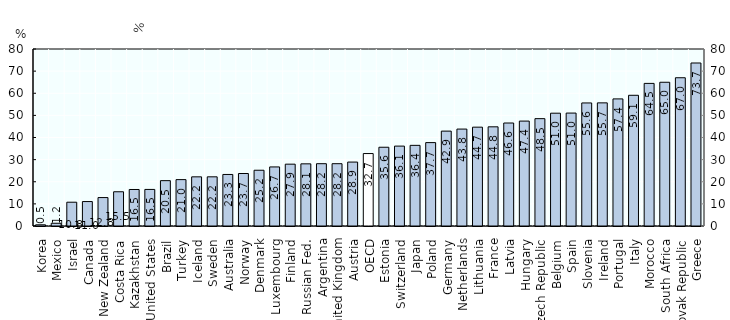
| Category | LTU Q3 2015 |
|---|---|
| Korea  | 0.538 |
| Mexico  | 1.238 |
| Israel  | 10.753 |
| Canada  | 11.049 |
| New Zealand  | 12.847 |
| Costa Rica  | 15.475 |
| Kazakhstan  | 16.5 |
| United States  | 16.532 |
| Brazil  | 20.497 |
| Turkey  | 20.964 |
| Iceland  | 22.222 |
| Sweden  | 22.226 |
| Australia  | 23.298 |
| Norway  | 23.723 |
| Denmark  | 25.2 |
| Luxembourg  | 26.7 |
| Finland  | 27.947 |
| Russian Fed.  | 28.1 |
| Argentina  | 28.161 |
| United Kingdom  | 28.163 |
| Austria  | 28.898 |
| OECD  | 32.747 |
| Estonia  | 35.6 |
| Switzerland  | 36.112 |
| Japan  | 36.449 |
| Poland  | 37.694 |
| Germany  | 42.887 |
| Netherlands  | 43.81 |
| Lithuania  | 44.672 |
| France  | 44.829 |
| Latvia  | 46.55 |
| Hungary  | 47.421 |
| Czech Republic  | 48.521 |
| Belgium  | 50.984 |
| Spain  | 51.043 |
| Slovenia  | 55.619 |
| Ireland  | 55.651 |
| Portugal  | 57.45 |
| Italy  | 59.077 |
| Morocco  | 64.45 |
| South Africa  | 64.971 |
| Slovak Republic  | 67.011 |
| Greece  | 73.675 |